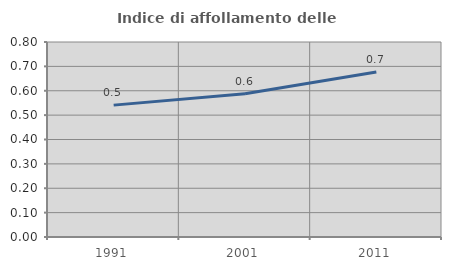
| Category | Indice di affollamento delle abitazioni  |
|---|---|
| 1991.0 | 0.541 |
| 2001.0 | 0.588 |
| 2011.0 | 0.677 |